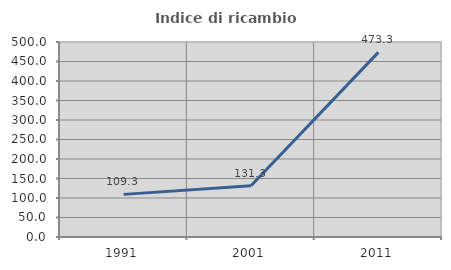
| Category | Indice di ricambio occupazionale  |
|---|---|
| 1991.0 | 109.302 |
| 2001.0 | 131.25 |
| 2011.0 | 473.333 |